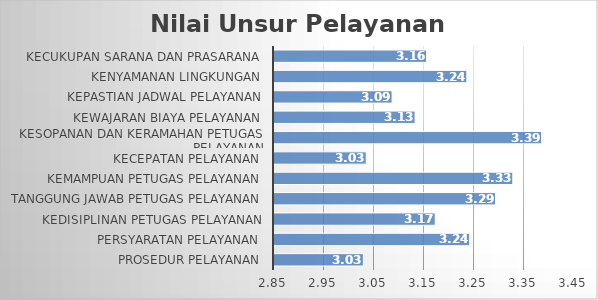
| Category | Nilai Unsur Pelayanan |
|---|---|
| Prosedur Pelayanan | 3.029 |
| Persyaratan Pelayanan | 3.241 |
| Kedisiplinan Petugas Pelayanan | 3.172 |
| Tanggung Jawab Petugas Pelayanan | 3.293 |
| Kemampuan Petugas Pelayanan | 3.328 |
| Kecepatan Pelayanan | 3.034 |
| Kesopanan dan Keramahan Petugas Pelayanan | 3.385 |
| Kewajaran Biaya Pelayanan | 3.132 |
| Kepastian Jadwal Pelayanan | 3.086 |
| Kenyamanan Lingkungan | 3.236 |
| Kecukupan Sarana dan Prasarana | 3.155 |